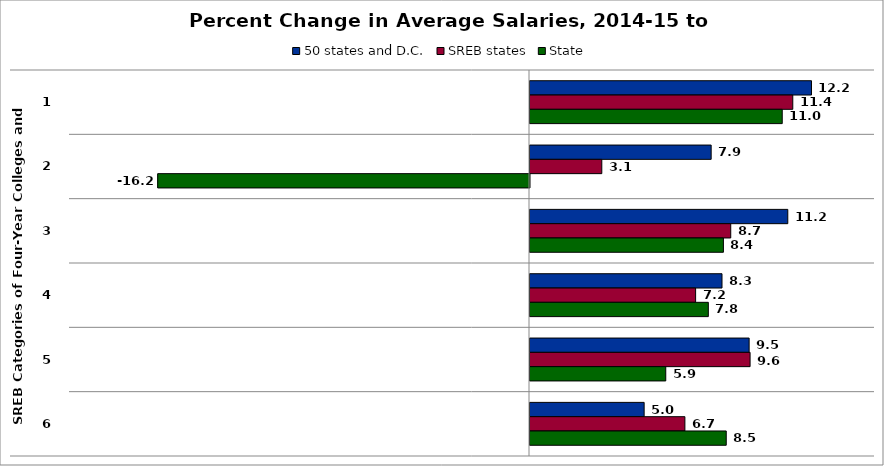
| Category | 50 states and D.C. | SREB states | State |
|---|---|---|---|
| 0 | 12.239 | 11.426 | 10.967 |
| 1 | 7.877 | 3.122 | -16.164 |
| 2 | 11.208 | 8.728 | 8.409 |
| 3 | 8.348 | 7.201 | 7.754 |
| 4 | 9.528 | 9.569 | 5.903 |
| 5 | 4.963 | 6.735 | 8.532 |